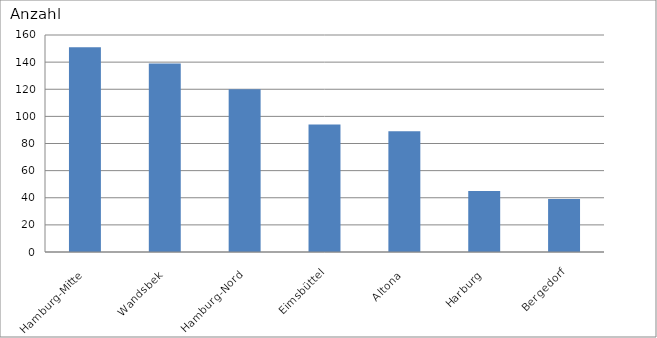
| Category | Hamburg-Mitte Wandsbek Hamburg-Nord Eimsbüttel Altona Harburg Bergedorf |
|---|---|
| Hamburg-Mitte | 151 |
| Wandsbek | 139 |
| Hamburg-Nord | 120 |
| Eimsbüttel | 94 |
| Altona | 89 |
| Harburg | 45 |
| Bergedorf | 39 |